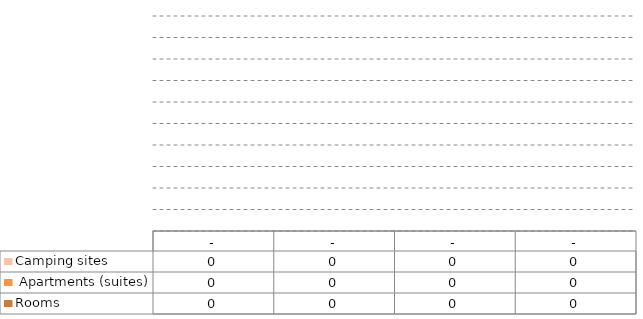
| Category | Rooms |  Apartments (suites) | Camping sites |
|---|---|---|---|
| - | 0 | 0 | 0 |
| - | 0 | 0 | 0 |
| - | 0 | 0 | 0 |
| - | 0 | 0 | 0 |